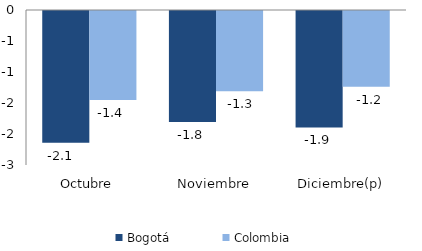
| Category | Bogotá | Colombia |
|---|---|---|
| Octubre | -2.125 | -1.436 |
| Noviembre | -1.792 | -1.295 |
| Diciembre(p) | -1.879 | -1.222 |